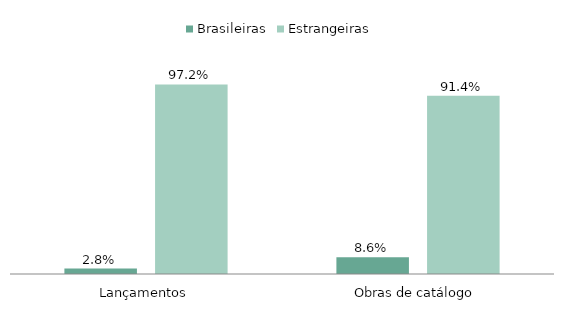
| Category | Brasileiras | Estrangeiras |
|---|---|---|
| Lançamentos | 0.028 | 0.972 |
| Obras de catálogo | 0.086 | 0.914 |